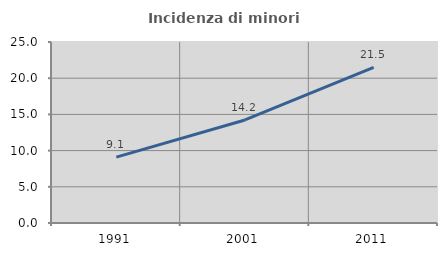
| Category | Incidenza di minori stranieri |
|---|---|
| 1991.0 | 9.091 |
| 2001.0 | 14.232 |
| 2011.0 | 21.501 |